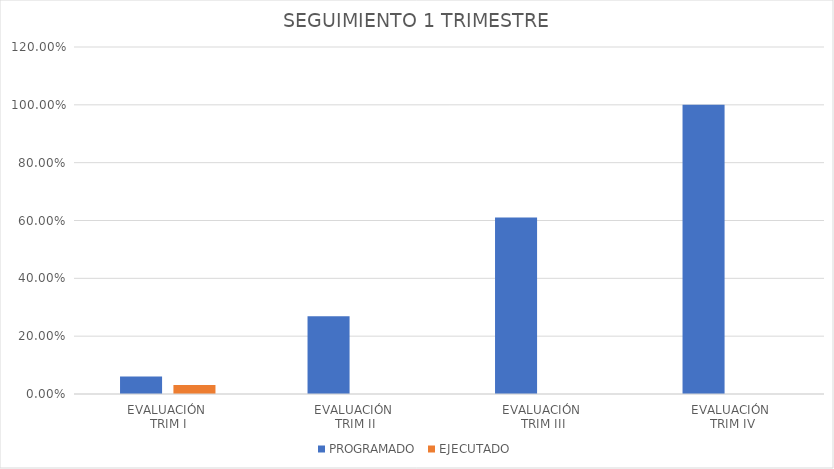
| Category | PROGRAMADO | EJECUTADO |
|---|---|---|
| EVALUACIÓN 
TRIM I | 0.06 | 0.031 |
| EVALUACIÓN 
TRIM II | 0.269 | 0 |
| EVALUACIÓN 
TRIM III | 0.61 | 0 |
| EVALUACIÓN
 TRIM IV | 1 | 0 |